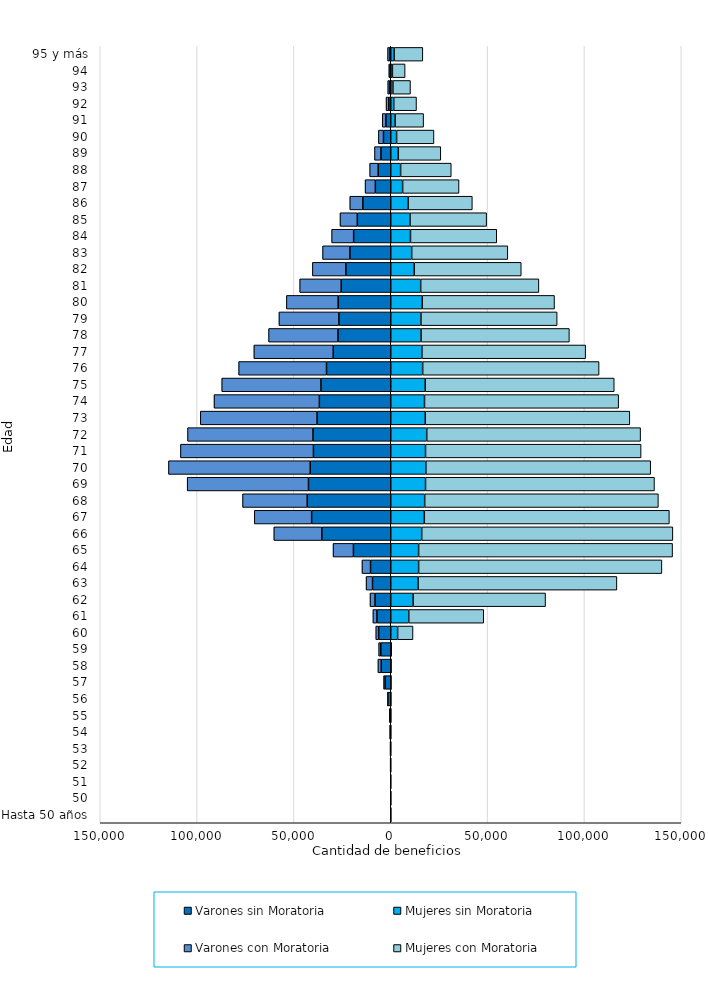
| Category | Varones sin Moratoria | Mujeres sin Moratoria | Varones con Moratoria | Mujeres con Moratoria |
|---|---|---|---|---|
| Hasta 50 años | -54 | 38 | -6 | 8 |
| 50 | -33 | 14 | -2 | 2 |
| 51 | -85 | 25 | -5 | 6 |
| 52 | -188 | 41 | -2 | 2 |
| 53 | -252 | 68 | -10 | 6 |
| 54 | -386 | 86 | -19 | 17 |
| 55 | -569 | 102 | -38 | 21 |
| 56 | -1498 | 129 | -160 | 22 |
| 57 | -2917 | 191 | -769 | 51 |
| 58 | -4924 | 226 | -1699 | 95 |
| 59 | -5143 | 275 | -1093 | 153 |
| 60 | -6237 | 3543 | -1488 | 7951 |
| 61 | -7139 | 9297 | -2062 | 38721 |
| 62 | -8135 | 11530 | -2570 | 68401 |
| 63 | -9402 | 14111 | -3336 | 102658 |
| 64 | -10429 | 14396 | -4428 | 125609 |
| 65 | -19270 | 14390 | -10519 | 131137 |
| 66 | -35585 | 15981 | -24784 | 129689 |
| 67 | -40858 | 17330 | -29593 | 126534 |
| 68 | -43145 | 17531 | -33379 | 120657 |
| 69 | -42480 | 17962 | -62626 | 118204 |
| 70 | -41577 | 18135 | -73204 | 116097 |
| 71 | -39924 | 17954 | -68668 | 111309 |
| 72 | -40158 | 18583 | -64762 | 110431 |
| 73 | -38063 | 17824 | -60271 | 105620 |
| 74 | -36867 | 17428 | -54382 | 100255 |
| 75 | -36054 | 17791 | -51208 | 97608 |
| 76 | -33174 | 16475 | -45352 | 91089 |
| 77 | -29691 | 16092 | -40978 | 84547 |
| 78 | -27250 | 15643 | -35829 | 76593 |
| 79 | -26767 | 15591 | -30962 | 70331 |
| 80 | -27163 | 16247 | -26719 | 68320 |
| 81 | -25595 | 15458 | -21417 | 61036 |
| 82 | -23163 | 12126 | -17291 | 55267 |
| 83 | -21085 | 10815 | -14115 | 49628 |
| 84 | -19163 | 10192 | -11352 | 44542 |
| 85 | -17273 | 9957 | -8925 | 39562 |
| 86 | -14403 | 8989 | -6743 | 33136 |
| 87 | -7958 | 6136 | -5291 | 29118 |
| 88 | -6485 | 5097 | -4389 | 26151 |
| 89 | -5065 | 3892 | -3310 | 21956 |
| 90 | -3762 | 3019 | -2615 | 19297 |
| 91 | -2497 | 2239 | -1881 | 14723 |
| 92 | -1007 | 1545 | -1406 | 11757 |
| 93 | -571 | 1115 | -977 | 9069 |
| 94 | -301 | 855 | -689 | 6559 |
| 95 y más | -425 | 1772 | -1207 | 14798 |